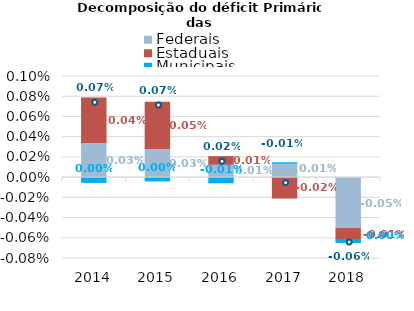
| Category | Federais | Estaduais | Municipais |
|---|---|---|---|
| 2014.0 | 0 | 0 | 0 |
| 2015.0 | 0 | 0 | 0 |
| 2016.0 | 0 | 0 | 0 |
| 2017.0 | 0 | 0 | 0 |
| 2018.0 | -0.001 | 0 | 0 |